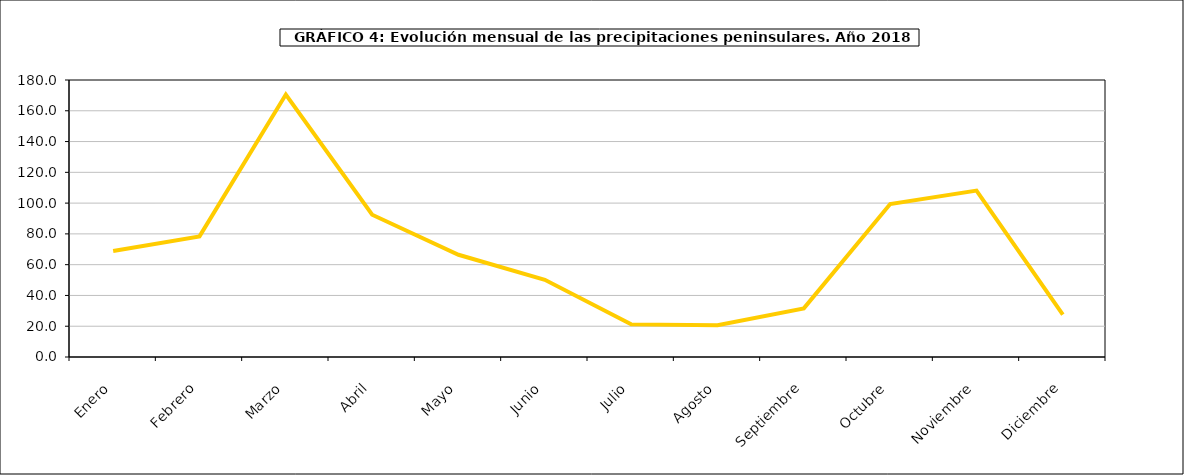
| Category | peninsula |
|---|---|
| 0 | 68.939 |
| 1 | 78.395 |
| 2 | 170.526 |
| 3 | 92.457 |
| 4 | 66.438 |
| 5 | 50.158 |
| 6 | 21.198 |
| 7 | 20.624 |
| 8 | 31.621 |
| 9 | 99.409 |
| 10 | 108.111 |
| 11 | 27.59 |